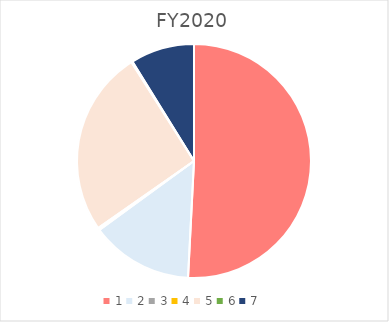
| Category | Series 0 |
|---|---|
| 0 | -5467.468 |
| 1 | 1523.053 |
| 2 | 18.31 |
| 3 | 15.6 |
| 4 | 2769.18 |
| 5 | 17 |
| 6 | 949.52 |